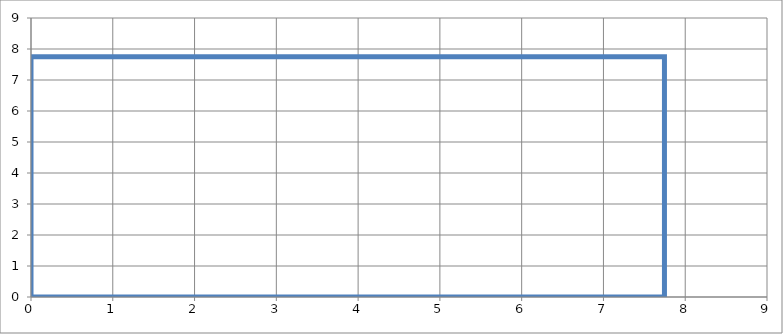
| Category | Series 0 |
|---|---|
| 0.0 | 0 |
| 7.746 | 0 |
| 7.746 | 7.746 |
| 0.0 | 7.746 |
| 0.0 | 0 |